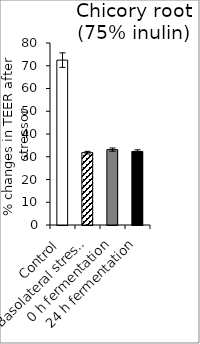
| Category | average |
|---|---|
| Control | 72.466 |
| Basolateral stressor | 31.799 |
| 0 h fermentation | 33.131 |
| 24 h fermentation | 32.334 |